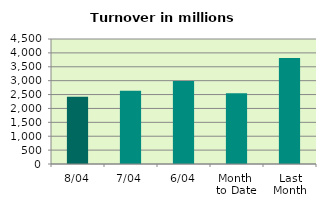
| Category | Series 0 |
|---|---|
| 8/04 | 2422.219 |
| 7/04 | 2633.301 |
| 6/04 | 2989.725 |
| Month 
to Date | 2545.391 |
| Last
Month | 3816.191 |